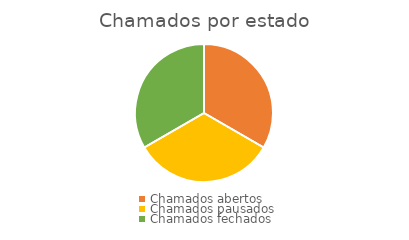
| Category | Series 0 |
|---|---|
| Chamados abertos | 1 |
| Chamados pausados | 1 |
| Chamados fechados | 1 |